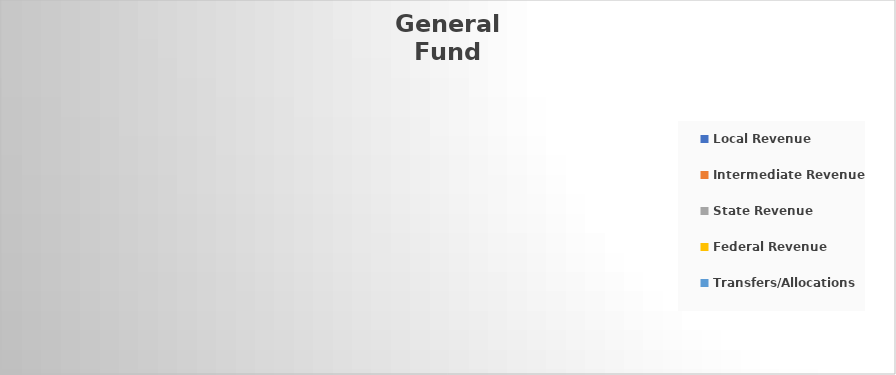
| Category | Series 0 |
|---|---|
| Local Revenue | 0 |
| Intermediate Revenue | 0 |
| State Revenue | 0 |
| Federal Revenue | 0 |
| Transfers/Allocations | 0 |